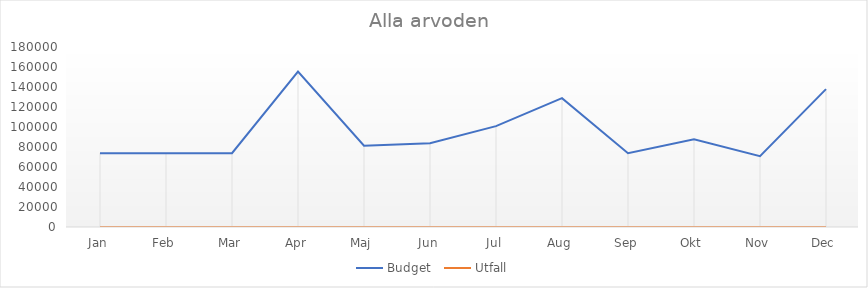
| Category | Budget  | Utfall |
|---|---|---|
| Jan | 73834 | 0 |
| Feb | 73834 | 0 |
| Mar | 73834 | 0 |
| Apr | 155334 | 0 |
| Maj | 81333 | 0 |
| Jun | 83833 | 0 |
| Jul | 100833 | 0 |
| Aug | 128833 | 0 |
| Sep | 73833 | 0 |
| Okt | 87833 | 0 |
| Nov | 70833 | 0 |
| Dec | 137833 | 0 |